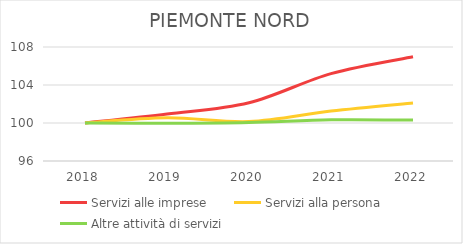
| Category | Servizi alle imprese | Servizi alla persona | Altre attività di servizi |
|---|---|---|---|
| 2018.0 | 100 | 100 | 100 |
| 2019.0 | 100.95 | 100.554 | 99.972 |
| 2020.0 | 102.133 | 100.151 | 100.055 |
| 2021.0 | 105.201 | 101.259 | 100.341 |
| 2022.0 | 106.976 | 102.115 | 100.314 |